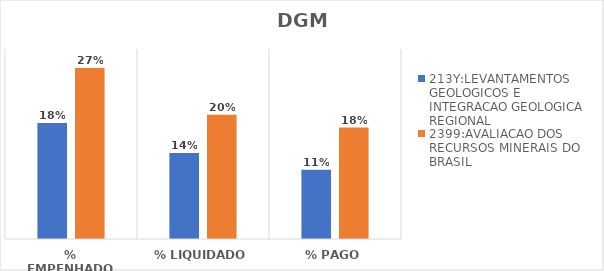
| Category | 213Y:LEVANTAMENTOS GEOLOGICOS E INTEGRACAO GEOLOGICA REGIONAL | 2399:AVALIACAO DOS RECURSOS MINERAIS DO BRASIL |
|---|---|---|
| % EMPENHADO | 0.183 | 0.27 |
| % LIQUIDADO | 0.136 | 0.196 |
| % PAGO | 0.109 | 0.176 |